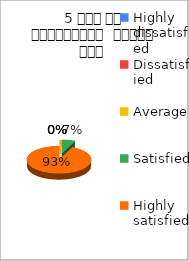
| Category | 5 समय पर पाठ्यक्रम  पूर्ण हुआ  |
|---|---|
| Highly dissatisfied | 0 |
| Dissatisfied | 0 |
| Average | 0 |
| Satisfied | 1 |
| Highly satisfied | 14 |